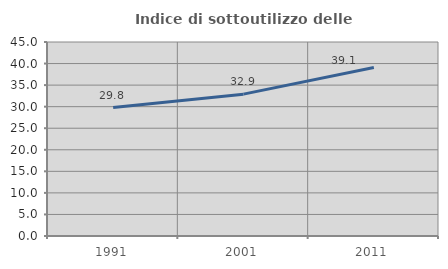
| Category | Indice di sottoutilizzo delle abitazioni  |
|---|---|
| 1991.0 | 29.795 |
| 2001.0 | 32.903 |
| 2011.0 | 39.073 |